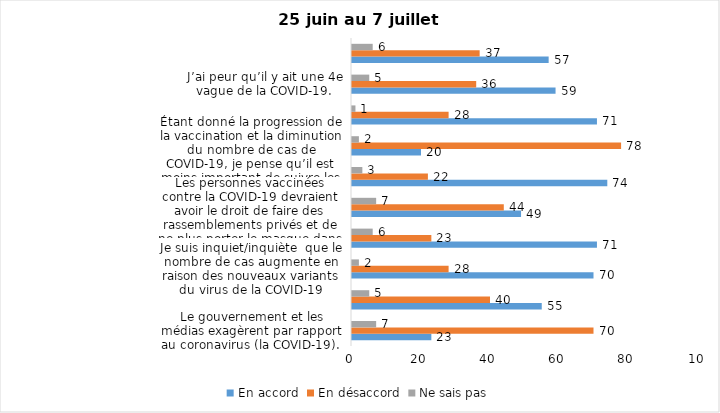
| Category | En accord | En désaccord | Ne sais pas |
|---|---|---|---|
| Le gouvernement et les médias exagèrent par rapport au coronavirus (la COVID-19). | 23 | 70 | 7 |
| J’ai peur que le système de santé soit débordé par les cas de COVID-19 suite au "déconfinement" | 55 | 40 | 5 |
| Je suis inquiet/inquiète  que le nombre de cas augmente en raison des nouveaux variants du virus de la COVID-19 | 70 | 28 | 2 |
| La frontière entre le Canada et les États-Unis devrait être fermée au moins jusqu’en septembre 2021 | 71 | 23 | 6 |
| Les personnes vaccinées contre la COVID-19 devraient avoir le droit de faire des rassemblements privés et de ne plus porter le masque dans les lieux publics. | 49 | 44 | 7 |
| Je suis favorable au passeport vaccinal qui permettrait l'accès à certains lieux ou activités aux personnes vaccinées. | 74 | 22 | 3 |
| Étant donné la progression de la vaccination et la diminution du nombre de cas de COVID-19, je pense qu’il est moins important de suivre les mesures de prévention. | 20 | 78 | 2 |
| Malgré la levée des mesures de confinement, je préfère limiter mes contacts avec d’autres personnes (par ex., en évitant les activités sociales et de groupes) | 71 | 28 | 1 |
| J’ai peur qu’il y ait une 4e vague de la COVID-19. | 59 | 36 | 5 |
| Dans les régions en zone verte, le risque d’attraper la COVID-19 est minime. | 57 | 37 | 6 |